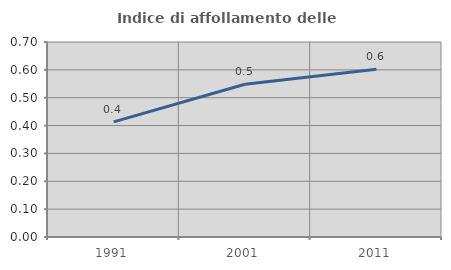
| Category | Indice di affollamento delle abitazioni  |
|---|---|
| 1991.0 | 0.413 |
| 2001.0 | 0.548 |
| 2011.0 | 0.602 |